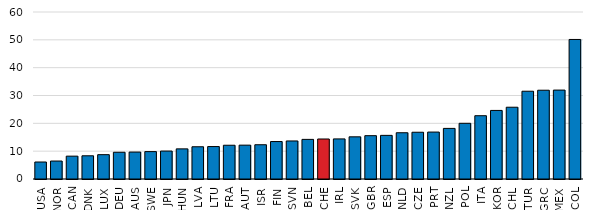
| Category | 2019 or latest available year |
|---|---|
| USA | 6.106 |
| NOR | 6.454 |
| CAN | 8.208 |
| DNK | 8.338 |
| LUX | 8.743 |
| DEU | 9.606 |
| AUS | 9.673 |
| SWE | 9.843 |
| JPN | 10.038 |
| HUN | 10.829 |
| LVA | 11.582 |
| LTU | 11.658 |
| FRA | 12.131 |
| AUT | 12.161 |
| ISR | 12.31 |
| FIN | 13.459 |
| SVN | 13.666 |
| BEL | 14.234 |
| CHE | 14.374 |
| IRL | 14.402 |
| SVK | 15.154 |
| GBR | 15.566 |
| ESP | 15.678 |
| NLD | 16.622 |
| CZE | 16.801 |
| PRT | 16.859 |
| NZL | 18.181 |
| POL | 20.009 |
| ITA | 22.741 |
| KOR | 24.639 |
| CHL | 25.786 |
| TUR | 31.538 |
| GRC | 31.896 |
| MEX | 31.946 |
| COL | 50.131 |